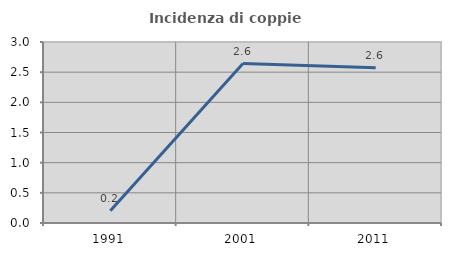
| Category | Incidenza di coppie miste |
|---|---|
| 1991.0 | 0.203 |
| 2001.0 | 2.642 |
| 2011.0 | 2.575 |